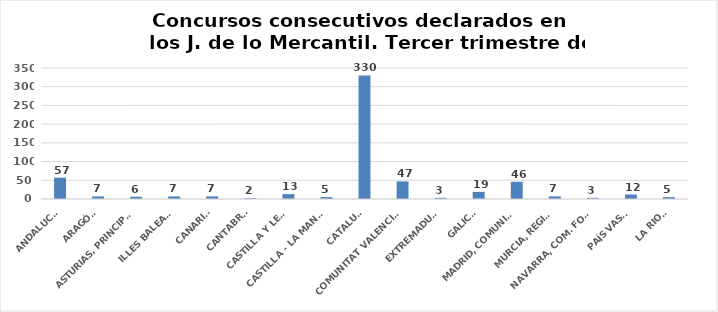
| Category | Series 0 |
|---|---|
| ANDALUCÍA | 57 |
| ARAGÓN | 7 |
| ASTURIAS, PRINCIPADO | 6 |
| ILLES BALEARS | 7 |
| CANARIAS | 7 |
| CANTABRIA | 2 |
| CASTILLA Y LEÓN | 13 |
| CASTILLA - LA MANCHA | 5 |
| CATALUÑA | 330 |
| COMUNITAT VALENCIANA | 47 |
| EXTREMADURA | 3 |
| GALICIA | 19 |
| MADRID, COMUNIDAD | 46 |
| MURCIA, REGIÓN | 7 |
| NAVARRA, COM. FORAL | 3 |
| PAÍS VASCO | 12 |
| LA RIOJA | 5 |